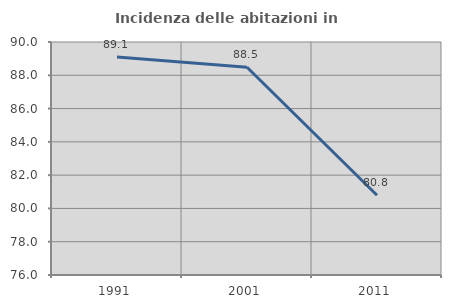
| Category | Incidenza delle abitazioni in proprietà  |
|---|---|
| 1991.0 | 89.103 |
| 2001.0 | 88.485 |
| 2011.0 | 80.791 |